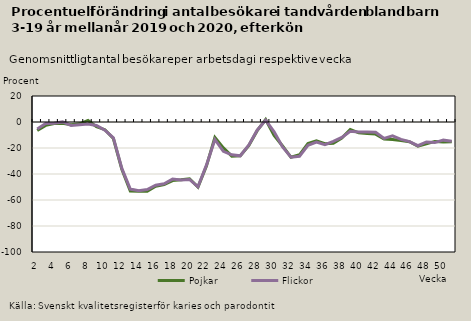
| Category | Pojkar | Flickor |
|---|---|---|
| 2.0 | -6.51 | -5.33 |
| 3.0 | -2.603 | -1.165 |
| 4.0 | -1.209 | -0.935 |
| 5.0 | -0.97 | 0.078 |
| 6.0 | -2.069 | -2.687 |
| 7.0 | -1.405 | -2.033 |
| 8.0 | 1.211 | -1.561 |
| 9.0 | -3.632 | -2.655 |
| 10.0 | -5.923 | -6.327 |
| 11.0 | -12.695 | -12.207 |
| 12.0 | -36.303 | -35.706 |
| 13.0 | -53.119 | -51.599 |
| 14.0 | -53.298 | -52.872 |
| 15.0 | -53.304 | -52.001 |
| 16.0 | -49.482 | -48.653 |
| 17.0 | -48.17 | -47.48 |
| 18.0 | -45.044 | -43.915 |
| 19.0 | -44.483 | -44.59 |
| 20.0 | -43.638 | -44.186 |
| 21.0 | -50.028 | -49.872 |
| 22.0 | -33.913 | -33.204 |
| 23.0 | -11.821 | -13.43 |
| 24.0 | -19.877 | -22.531 |
| 25.0 | -26.228 | -25.205 |
| 26.0 | -25.903 | -26 |
| 27.0 | -18.184 | -17.877 |
| 28.0 | -6.663 | -6.313 |
| 29.0 | 1.89 | 1.437 |
| 30.0 | -10.28 | -7.52 |
| 31.0 | -18.425 | -19.192 |
| 32.0 | -27.164 | -27.117 |
| 33.0 | -25.239 | -26.371 |
| 34.0 | -16.632 | -17.894 |
| 35.0 | -14.399 | -15.467 |
| 36.0 | -16.651 | -17.422 |
| 37.0 | -16.335 | -14.87 |
| 38.0 | -12.321 | -11.834 |
| 39.0 | -5.691 | -7.19 |
| 40.0 | -8.339 | -7.707 |
| 41.0 | -8.801 | -7.635 |
| 42.0 | -9.308 | -7.927 |
| 43.0 | -13.042 | -12.581 |
| 44.0 | -13.385 | -10.705 |
| 45.0 | -14.281 | -13.344 |
| 46.0 | -15.122 | -15.126 |
| 47.0 | -18.646 | -18.249 |
| 48.0 | -16.803 | -15.342 |
| 49.0 | -14.917 | -15.833 |
| 50.0 | -15.302 | -13.957 |
| 51.0 | -15.243 | -14.748 |